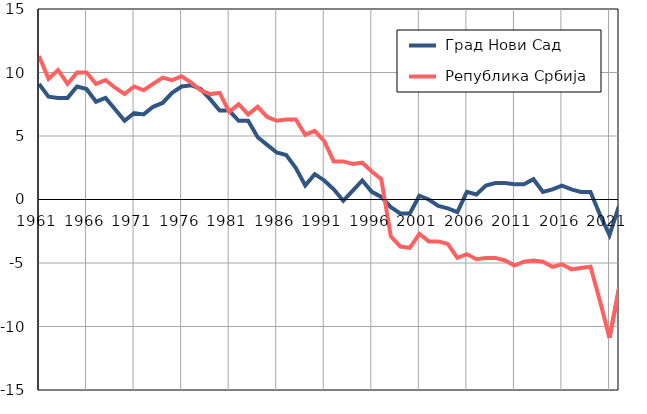
| Category |  Град Нови Сад |  Република Србија |
|---|---|---|
| 1961.0 | 9.1 | 11.3 |
| 1962.0 | 8.1 | 9.5 |
| 1963.0 | 8 | 10.2 |
| 1964.0 | 8 | 9.1 |
| 1965.0 | 8.9 | 10 |
| 1966.0 | 8.7 | 10 |
| 1967.0 | 7.7 | 9.1 |
| 1968.0 | 8 | 9.4 |
| 1969.0 | 7.1 | 8.8 |
| 1970.0 | 6.2 | 8.3 |
| 1971.0 | 6.8 | 8.9 |
| 1972.0 | 6.7 | 8.6 |
| 1973.0 | 7.3 | 9.1 |
| 1974.0 | 7.6 | 9.6 |
| 1975.0 | 8.4 | 9.4 |
| 1976.0 | 8.9 | 9.7 |
| 1977.0 | 9 | 9.2 |
| 1978.0 | 8.7 | 8.6 |
| 1979.0 | 7.9 | 8.3 |
| 1980.0 | 7 | 8.4 |
| 1981.0 | 7 | 6.9 |
| 1982.0 | 6.2 | 7.5 |
| 1983.0 | 6.2 | 6.7 |
| 1984.0 | 4.9 | 7.3 |
| 1985.0 | 4.3 | 6.5 |
| 1986.0 | 3.7 | 6.2 |
| 1987.0 | 3.5 | 6.3 |
| 1988.0 | 2.5 | 6.3 |
| 1989.0 | 1.1 | 5.1 |
| 1990.0 | 2 | 5.4 |
| 1991.0 | 1.5 | 4.6 |
| 1992.0 | 0.8 | 3 |
| 1993.0 | -0.1 | 3 |
| 1994.0 | 0.7 | 2.8 |
| 1995.0 | 1.5 | 2.9 |
| 1996.0 | 0.6 | 2.2 |
| 1997.0 | 0.2 | 1.6 |
| 1998.0 | -0.6 | -2.9 |
| 1999.0 | -1.1 | -3.7 |
| 2000.0 | -1.1 | -3.8 |
| 2001.0 | 0.3 | -2.7 |
| 2002.0 | 0 | -3.3 |
| 2003.0 | -0.5 | -3.3 |
| 2004.0 | -0.7 | -3.5 |
| 2005.0 | -1 | -4.6 |
| 2006.0 | 0.6 | -4.3 |
| 2007.0 | 0.4 | -4.7 |
| 2008.0 | 1.1 | -4.6 |
| 2009.0 | 1.3 | -4.6 |
| 2010.0 | 1.3 | -4.8 |
| 2011.0 | 1.2 | -5.2 |
| 2012.0 | 1.2 | -4.9 |
| 2013.0 | 1.6 | -4.8 |
| 2014.0 | 0.6 | -4.9 |
| 2015.0 | 0.8 | -5.3 |
| 2016.0 | 1.1 | -5.1 |
| 2017.0 | 0.8 | -5.5 |
| 2018.0 | 0.6 | -5.4 |
| 2019.0 | 0.6 | -5.3 |
| 2020.0 | -1.2 | -8 |
| 2021.0 | -2.8 | -10.9 |
| 2022.0 | -0.5 | -7 |